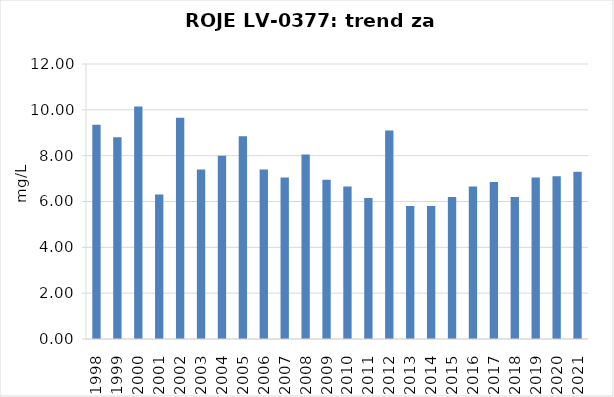
| Category | Vsota |
|---|---|
| 1998 | 9.35 |
| 1999 | 8.8 |
| 2000 | 10.15 |
| 2001 | 6.3 |
| 2002 | 9.65 |
| 2003 | 7.4 |
| 2004 | 8 |
| 2005 | 8.85 |
| 2006 | 7.4 |
| 2007 | 7.05 |
| 2008 | 8.05 |
| 2009 | 6.95 |
| 2010 | 6.65 |
| 2011 | 6.15 |
| 2012 | 9.1 |
| 2013 | 5.8 |
| 2014 | 5.8 |
| 2015 | 6.2 |
| 2016 | 6.65 |
| 2017 | 6.85 |
| 2018 | 6.2 |
| 2019 | 7.05 |
| 2020 | 7.1 |
| 2021 | 7.3 |